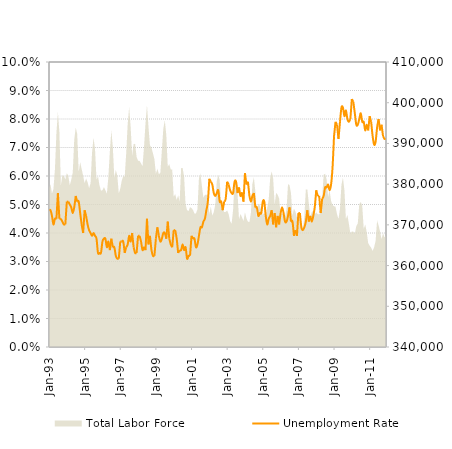
| Category | Unemployment Rate |
|---|---|
| 1993-01-01 | 0.048 |
| 1993-02-11 | 0.048 |
| 1993-03-11 | 0.046 |
| 1993-04-11 | 0.043 |
| 1993-05-11 | 0.045 |
| 1993-06-11 | 0.045 |
| 1993-07-11 | 0.054 |
| 1993-08-11 | 0.045 |
| 1993-09-11 | 0.045 |
| 1993-10-11 | 0.044 |
| 1993-11-11 | 0.043 |
| 1993-12-11 | 0.043 |
| 1994-01-11 | 0.051 |
| 1994-02-11 | 0.051 |
| 1994-03-11 | 0.05 |
| 1994-04-11 | 0.049 |
| 1994-05-11 | 0.047 |
| 1994-06-11 | 0.049 |
| 1994-07-11 | 0.053 |
| 1994-08-11 | 0.051 |
| 1994-09-11 | 0.051 |
| 1994-10-11 | 0.047 |
| 1994-11-11 | 0.043 |
| 1994-12-11 | 0.04 |
| 1995-01-11 | 0.048 |
| 1995-02-11 | 0.046 |
| 1995-03-11 | 0.043 |
| 1995-04-11 | 0.041 |
| 1995-05-11 | 0.04 |
| 1995-06-11 | 0.039 |
| 1995-07-11 | 0.04 |
| 1995-08-11 | 0.039 |
| 1995-09-11 | 0.038 |
| 1995-10-11 | 0.033 |
| 1995-11-11 | 0.033 |
| 1995-12-11 | 0.033 |
| 1996-01-11 | 0.037 |
| 1996-02-11 | 0.038 |
| 1996-03-11 | 0.038 |
| 1996-04-11 | 0.035 |
| 1996-05-11 | 0.037 |
| 1996-06-11 | 0.034 |
| 1996-07-11 | 0.038 |
| 1996-08-11 | 0.035 |
| 1996-09-11 | 0.035 |
| 1996-10-11 | 0.032 |
| 1996-11-11 | 0.031 |
| 1996-12-11 | 0.031 |
| 1997-01-11 | 0.037 |
| 1997-02-11 | 0.037 |
| 1997-03-11 | 0.037 |
| 1997-04-11 | 0.033 |
| 1997-05-11 | 0.035 |
| 1997-06-11 | 0.036 |
| 1997-07-11 | 0.039 |
| 1997-08-11 | 0.037 |
| 1997-09-11 | 0.04 |
| 1997-10-11 | 0.035 |
| 1997-11-11 | 0.033 |
| 1997-12-11 | 0.033 |
| 1998-01-11 | 0.039 |
| 1998-02-11 | 0.039 |
| 1998-03-11 | 0.037 |
| 1998-04-11 | 0.034 |
| 1998-05-11 | 0.035 |
| 1998-06-11 | 0.034 |
| 1998-07-11 | 0.045 |
| 1998-08-11 | 0.036 |
| 1998-09-11 | 0.039 |
| 1998-10-11 | 0.034 |
| 1998-11-11 | 0.032 |
| 1998-12-11 | 0.032 |
| 1999-01-11 | 0.038 |
| 1999-02-11 | 0.042 |
| 1999-03-11 | 0.039 |
| 1999-04-11 | 0.037 |
| 1999-05-11 | 0.038 |
| 1999-06-11 | 0.04 |
| 1999-07-11 | 0.04 |
| 1999-08-11 | 0.038 |
| 1999-09-11 | 0.044 |
| 1999-10-11 | 0.038 |
| 1999-11-11 | 0.036 |
| 1999-12-11 | 0.035 |
| 2000-01-11 | 0.041 |
| 2000-02-11 | 0.041 |
| 2000-03-11 | 0.038 |
| 2000-04-11 | 0.033 |
| 2000-05-11 | 0.034 |
| 2000-06-11 | 0.034 |
| 2000-07-11 | 0.036 |
| 2000-08-11 | 0.034 |
| 2000-09-11 | 0.035 |
| 2000-10-11 | 0.031 |
| 2000-11-11 | 0.032 |
| 2000-12-11 | 0.032 |
| 2001-01-11 | 0.039 |
| 2001-02-11 | 0.038 |
| 2001-03-11 | 0.038 |
| 2001-04-11 | 0.035 |
| 2001-05-11 | 0.036 |
| 2001-06-11 | 0.039 |
| 2001-07-11 | 0.042 |
| 2001-08-11 | 0.042 |
| 2001-09-11 | 0.044 |
| 2001-10-11 | 0.045 |
| 2001-11-11 | 0.048 |
| 2001-12-11 | 0.051 |
| 2002-01-11 | 0.059 |
| 2002-02-11 | 0.058 |
| 2002-03-11 | 0.057 |
| 2002-04-11 | 0.054 |
| 2002-05-11 | 0.053 |
| 2002-06-11 | 0.054 |
| 2002-07-11 | 0.055 |
| 2002-08-11 | 0.051 |
| 2002-09-11 | 0.051 |
| 2002-10-11 | 0.048 |
| 2002-11-11 | 0.051 |
| 2002-12-11 | 0.052 |
| 2003-01-11 | 0.058 |
| 2003-02-11 | 0.057 |
| 2003-03-11 | 0.055 |
| 2003-04-11 | 0.054 |
| 2003-05-11 | 0.054 |
| 2003-06-11 | 0.058 |
| 2003-07-11 | 0.058 |
| 2003-08-11 | 0.054 |
| 2003-09-11 | 0.056 |
| 2003-10-11 | 0.053 |
| 2003-11-11 | 0.054 |
| 2003-12-11 | 0.051 |
| 2004-01-11 | 0.061 |
| 2004-02-11 | 0.057 |
| 2004-03-11 | 0.058 |
| 2004-04-11 | 0.053 |
| 2004-05-11 | 0.051 |
| 2004-06-11 | 0.053 |
| 2004-07-11 | 0.054 |
| 2004-08-11 | 0.049 |
| 2004-09-11 | 0.049 |
| 2004-10-11 | 0.046 |
| 2004-11-11 | 0.047 |
| 2004-12-11 | 0.047 |
| 2005-01-11 | 0.051 |
| 2005-02-11 | 0.051 |
| 2005-03-11 | 0.046 |
| 2005-04-11 | 0.043 |
| 2005-05-11 | 0.045 |
| 2005-06-11 | 0.046 |
| 2005-07-11 | 0.048 |
| 2005-08-11 | 0.043 |
| 2005-09-11 | 0.047 |
| 2005-10-11 | 0.042 |
| 2005-11-11 | 0.046 |
| 2005-12-11 | 0.043 |
| 2006-01-11 | 0.047 |
| 2006-02-11 | 0.049 |
| 2006-03-11 | 0.047 |
| 2006-04-11 | 0.044 |
| 2006-05-11 | 0.044 |
| 2006-06-11 | 0.046 |
| 2006-07-11 | 0.049 |
| 2006-08-11 | 0.044 |
| 2006-09-11 | 0.044 |
| 2006-10-11 | 0.039 |
| 2006-11-11 | 0.041 |
| 2006-12-11 | 0.039 |
| 2007-01-11 | 0.047 |
| 2007-02-11 | 0.047 |
| 2007-03-11 | 0.042 |
| 2007-04-11 | 0.041 |
| 2007-05-11 | 0.042 |
| 2007-06-11 | 0.044 |
| 2007-07-11 | 0.048 |
| 2007-08-11 | 0.044 |
| 2007-09-11 | 0.046 |
| 2007-10-11 | 0.044 |
| 2007-11-11 | 0.046 |
| 2007-12-11 | 0.049 |
| 2008-01-11 | 0.055 |
| 2008-02-11 | 0.053 |
| 2008-03-11 | 0.053 |
| 2008-04-11 | 0.047 |
| 2008-05-11 | 0.052 |
| 2008-06-11 | 0.053 |
| 2008-07-11 | 0.056 |
| 2008-08-11 | 0.056 |
| 2008-09-11 | 0.057 |
| 2008-10-11 | 0.055 |
| 2008-11-11 | 0.057 |
| 2008-12-11 | 0.063 |
| 2009-01-11 | 0.074 |
| 2009-02-11 | 0.079 |
| 2009-03-11 | 0.078 |
| 2009-04-11 | 0.073 |
| 2009-05-11 | 0.079 |
| 2009-06-11 | 0.084 |
| 2009-07-11 | 0.084 |
| 2009-08-11 | 0.081 |
| 2009-09-11 | 0.083 |
| 2009-10-11 | 0.08 |
| 2009-11-11 | 0.079 |
| 2009-12-11 | 0.08 |
| 2010-01-11 | 0.087 |
| 2010-02-11 | 0.086 |
| 2010-03-11 | 0.082 |
| 2010-04-11 | 0.078 |
| 2010-05-11 | 0.078 |
| 2010-06-11 | 0.08 |
| 2010-07-11 | 0.082 |
| 2010-08-11 | 0.079 |
| 2010-09-11 | 0.079 |
| 2010-10-11 | 0.076 |
| 2010-11-11 | 0.078 |
| 2010-12-11 | 0.076 |
| 2011-01-11 | 0.081 |
| 2011-02-11 | 0.079 |
| 2011-03-11 | 0.074 |
| 2011-04-11 | 0.071 |
| 2011-05-11 | 0.072 |
| 2011-06-11 | 0.077 |
| 2011-07-11 | 0.08 |
| 2011-08-11 | 0.076 |
| 2011-09-11 | 0.078 |
| 2011-10-11 | 0.074 |
| 2011-11-11 | 0.073 |
| 2011-12-11 | 0.073 |